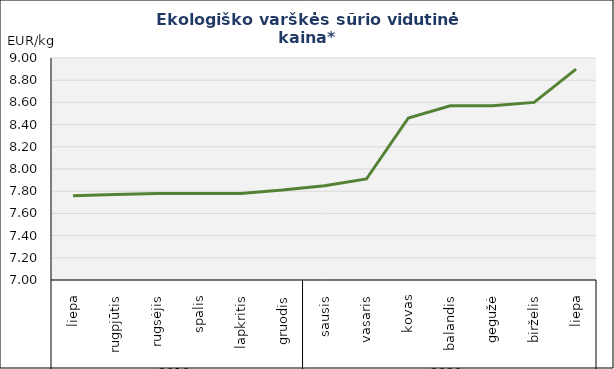
| Category | Varškės sūris |
|---|---|
| 0 | 7.76 |
| 1 | 7.77 |
| 2 | 7.78 |
| 3 | 7.78 |
| 4 | 7.78 |
| 5 | 7.81 |
| 6 | 7.85 |
| 7 | 7.91 |
| 8 | 8.46 |
| 9 | 8.57 |
| 10 | 8.57 |
| 11 | 8.6 |
| 12 | 8.9 |